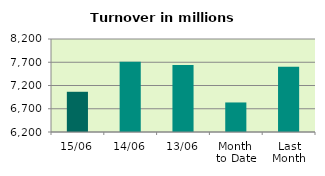
| Category | Series 0 |
|---|---|
| 15/06 | 7064.879 |
| 14/06 | 7709.594 |
| 13/06 | 7639.11 |
| Month 
to Date | 6835.311 |
| Last
Month | 7604.877 |